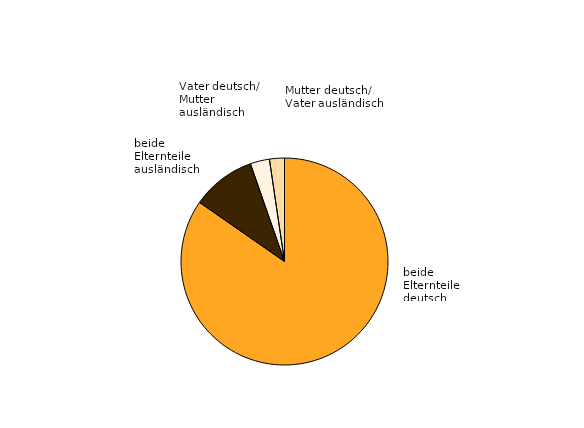
| Category | Anzahl | Anteil |
|---|---|---|
| beide 
deutsch | 16112 | 84.7 |
| beide 
ausländisch | 1900 | 10 |
| Mann deutsch / 
Frau ausländisch | 573 | 3 |
| Mann ausländisch/
Frau deutsch | 444 | 2.3 |